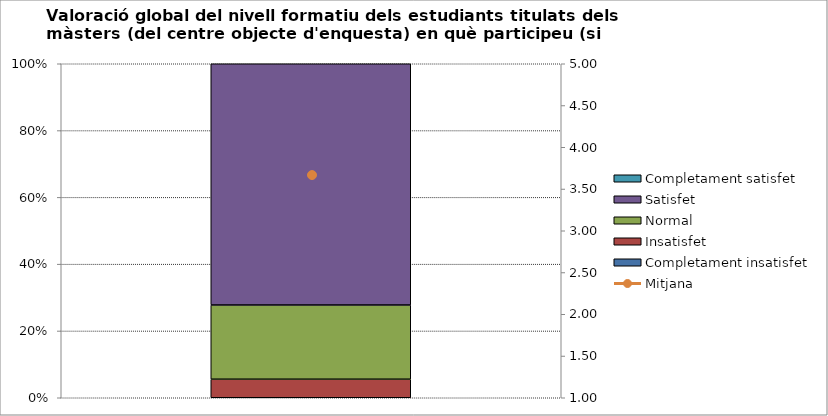
| Category | Completament insatisfet | Insatisfet | Normal | Satisfet | Completament satisfet |
|---|---|---|---|---|---|
| 0 | 0 | 1 | 4 | 13 | 0 |